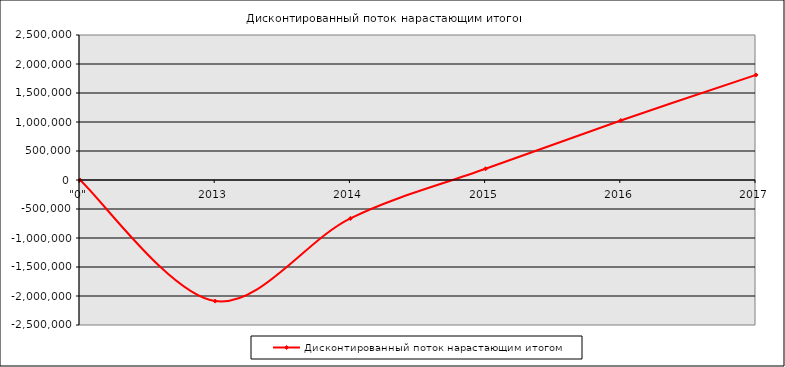
| Category | Дисконтированный поток нарастающим итогом |
|---|---|
| "0" | 0 |
| 2013 | -2087679.925 |
| 2014 | -662349.81 |
| 2015 | 193819.974 |
| 2016 | 1025098.61 |
| 2017 | 1811605.963 |